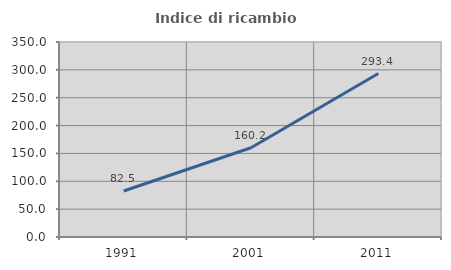
| Category | Indice di ricambio occupazionale  |
|---|---|
| 1991.0 | 82.522 |
| 2001.0 | 160.185 |
| 2011.0 | 293.382 |